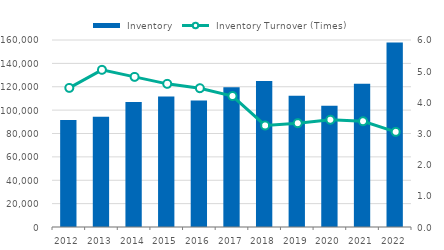
| Category |  Inventory |
|---|---|
| 2012.0 | 91633 |
| 2013.0 | 94345 |
| 2014.0 | 106848.5 |
| 2015.0 | 111643.5 |
| 2016.0 | 108335.5 |
| 2017.0 | 119492.5 |
| 2018.0 | 124980 |
| 2019.0 | 112340 |
| 2020.0 | 103783 |
| 2021.0 | 122600 |
| 2022.0 | 157930.5 |